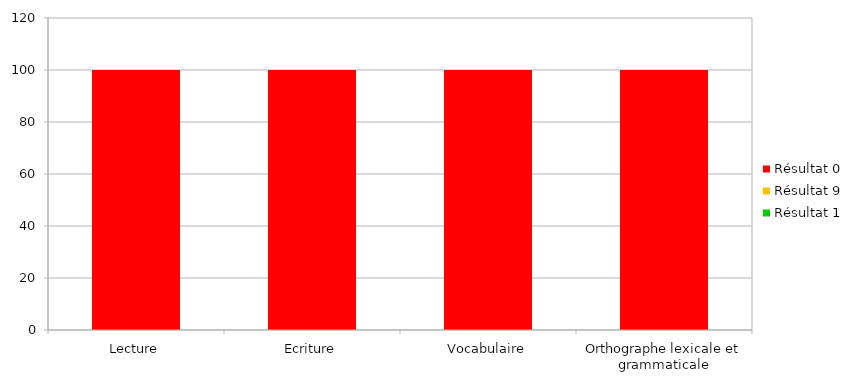
| Category | Résultat 1 | Résultat 9 | Résultat 0 |
|---|---|---|---|
| Lecture | 0 | 0 | 100 |
| Ecriture | 0 | 0 | 100 |
| Vocabulaire | 0 | 0 | 100 |
| Orthographe lexicale et grammaticale | 0 | 0 | 100 |